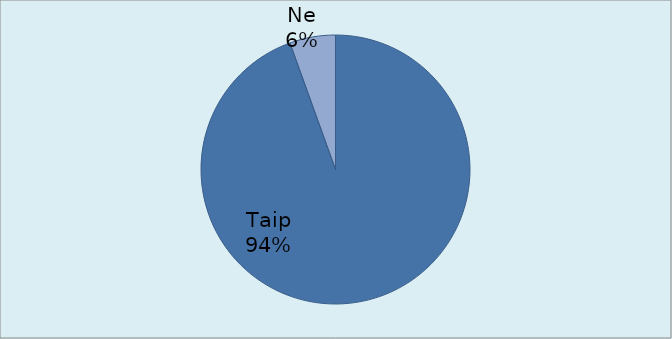
| Category | Series 0 |
|---|---|
| Taip | 103 |
| Ne | 6 |